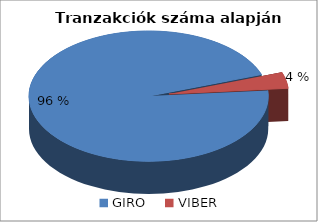
| Category | Series 0 |
|---|---|
| GIRO | 0.96 |
| VIBER | 0.04 |